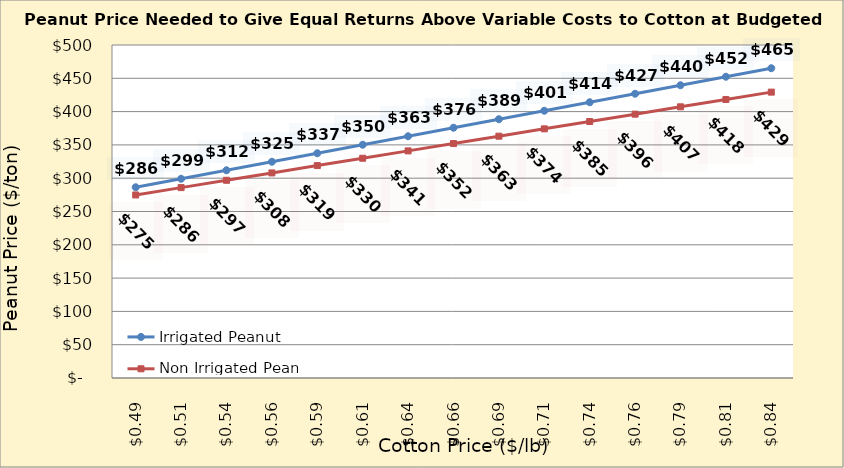
| Category | Irrigated Peanut | Non Irrigated Peanut |
|---|---|---|
| 0.4849999999999999 | 286.402 | 274.826 |
| 0.5099999999999999 | 299.168 | 285.856 |
| 0.5349999999999999 | 311.934 | 296.885 |
| 0.5599999999999999 | 324.7 | 307.914 |
| 0.585 | 337.466 | 318.944 |
| 0.61 | 350.232 | 329.973 |
| 0.635 | 362.998 | 341.003 |
| 0.66 | 375.764 | 352.032 |
| 0.685 | 388.53 | 363.062 |
| 0.7100000000000001 | 401.296 | 374.091 |
| 0.7350000000000001 | 414.062 | 385.12 |
| 0.7600000000000001 | 426.828 | 396.15 |
| 0.7850000000000001 | 439.594 | 407.179 |
| 0.8100000000000002 | 452.36 | 418.209 |
| 0.8350000000000002 | 465.126 | 429.238 |